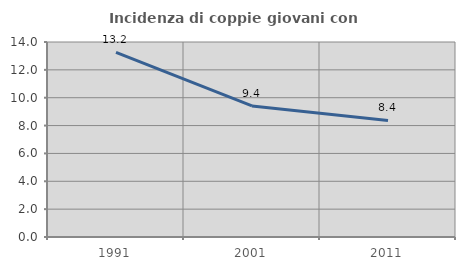
| Category | Incidenza di coppie giovani con figli |
|---|---|
| 1991.0 | 13.248 |
| 2001.0 | 9.412 |
| 2011.0 | 8.365 |